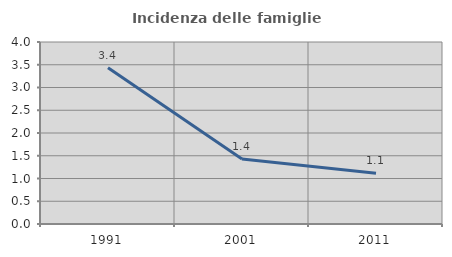
| Category | Incidenza delle famiglie numerose |
|---|---|
| 1991.0 | 3.436 |
| 2001.0 | 1.427 |
| 2011.0 | 1.114 |